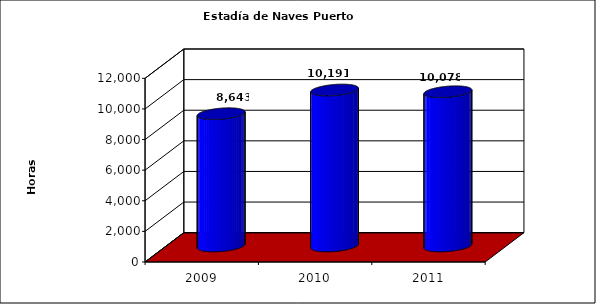
| Category | Series 0 |
|---|---|
| 2009.0 | 8642.853 |
| 2010.0 | 10191.117 |
| 2011.0 | 10077.88 |